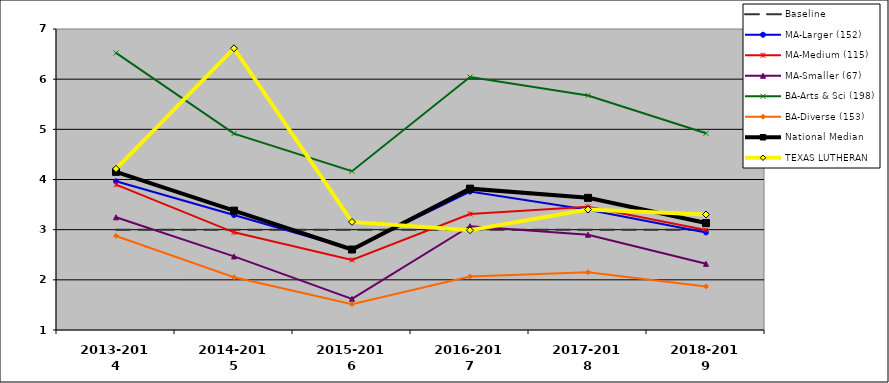
| Category | Baseline | MA-Larger (152) | MA-Medium (115) | MA-Smaller (67) | BA-Arts & Sci (198) | BA-Diverse (153) | National Median | TEXAS LUTHERAN |
|---|---|---|---|---|---|---|---|---|
| 2013-2014 | 3 | 3.964 | 3.899 | 3.246 | 6.523 | 2.875 | 4.153 | 4.212 |
| 2014-2015 | 3 | 3.291 | 2.947 | 2.467 | 4.914 | 2.051 | 3.379 | 6.615 |
| 2015-2016 | 3 | 2.611 | 2.398 | 1.622 | 4.165 | 1.515 | 2.604 | 3.155 |
| 2016-2017 | 3 | 3.759 | 3.313 | 3.069 | 6.043 | 2.066 | 3.818 | 2.989 |
| 2017-2018 | 3 | 3.396 | 3.457 | 2.899 | 5.675 | 2.152 | 3.634 | 3.403 |
| 2018-2019 | 3 | 2.946 | 2.995 | 2.319 | 4.921 | 1.869 | 3.133 | 3.303 |